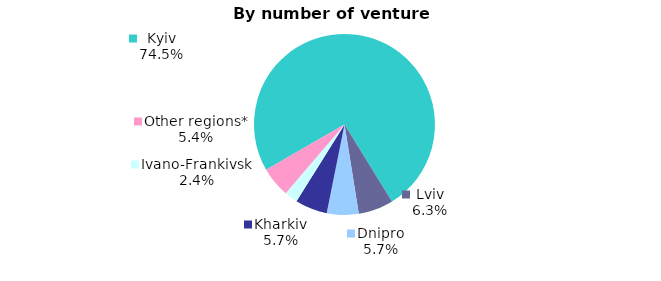
| Category | Series 0 |
|---|---|
| Kyiv | 0.745 |
| Lviv | 0.063 |
| Dnipro | 0.057 |
| Kharkiv | 0.057 |
| Ivano-Frankivsk | 0.023 |
| Other regions* | 0.054 |